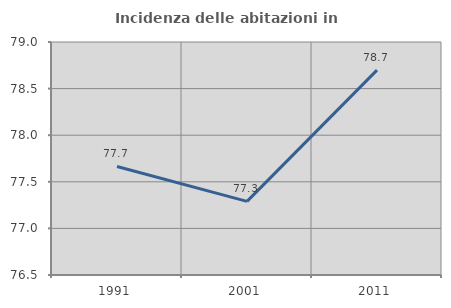
| Category | Incidenza delle abitazioni in proprietà  |
|---|---|
| 1991.0 | 77.664 |
| 2001.0 | 77.29 |
| 2011.0 | 78.698 |